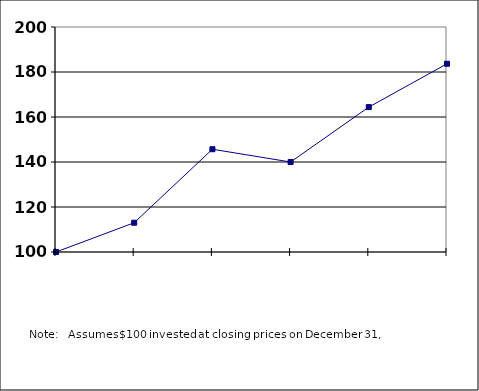
| Category |  100.00  |
|---|---|
| nan | 100 |
| 2013.0 | 113.007 |
| 2014.0 | 145.677 |
| 2015.0 | 139.99 |
| 2016.0 | 164.398 |
| 2017.0 | 183.659 |